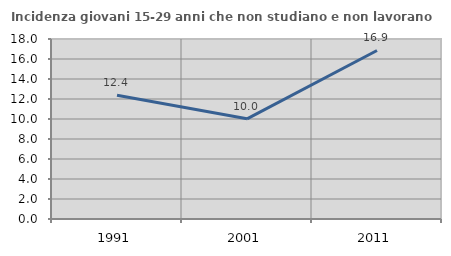
| Category | Incidenza giovani 15-29 anni che non studiano e non lavorano  |
|---|---|
| 1991.0 | 12.382 |
| 2001.0 | 10.019 |
| 2011.0 | 16.854 |